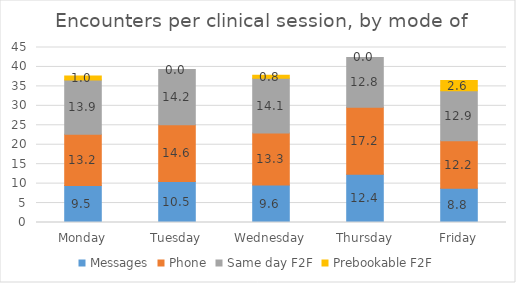
| Category | Messages | Phone | Same day F2F | Prebookable F2F |
|---|---|---|---|---|
| Monday | 9.523 | 13.186 | 13.918 | 1.041 |
| Tuesday | 10.527 | 14.576 | 14.208 | 0 |
| Wednesday | 9.641 | 13.349 | 14.091 | 0.78 |
| Thursday | 12.439 | 17.224 | 12.778 | 0 |
| Friday | 8.804 | 12.19 | 12.867 | 2.63 |